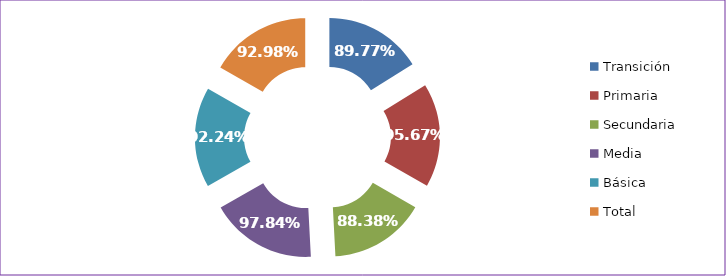
| Category | Tasa Aprobación |
|---|---|
| Transición | 0.898 |
| Primaria | 0.957 |
| Secundaria | 0.884 |
| Media | 0.978 |
| Básica | 0.922 |
| Total | 0.93 |